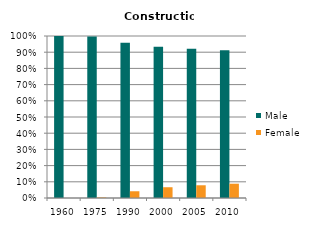
| Category | Male | Female |
|---|---|---|
| 1960.0 | 1 | 0 |
| 1975.0 | 0.997 | 0.003 |
| 1990.0 | 0.958 | 0.042 |
| 2000.0 | 0.934 | 0.066 |
| 2005.0 | 0.921 | 0.079 |
| 2010.0 | 0.912 | 0.088 |